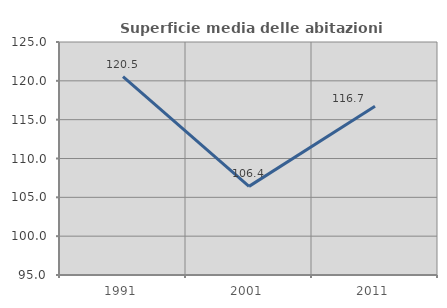
| Category | Superficie media delle abitazioni occupate |
|---|---|
| 1991.0 | 120.538 |
| 2001.0 | 106.41 |
| 2011.0 | 116.721 |